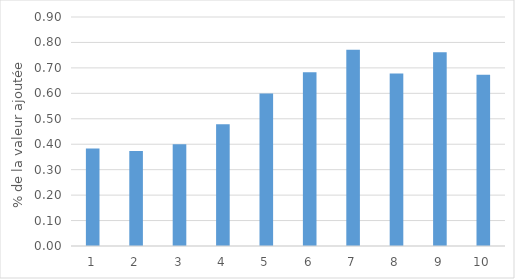
| Category | Part de la valeur ajoutée du décile |
|---|---|
| 1.0 | 0.384 |
| 2.0 | 0.374 |
| 3.0 | 0.4 |
| 4.0 | 0.479 |
| 5.0 | 0.599 |
| 6.0 | 0.683 |
| 7.0 | 0.772 |
| 8.0 | 0.678 |
| 9.0 | 0.762 |
| 10.0 | 0.673 |